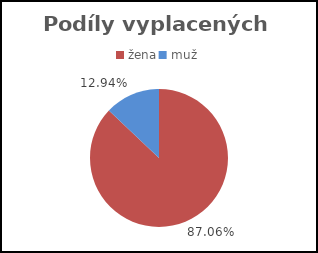
| Category | Celkem |
|---|---|
| žena | 0.871 |
| muž | 0.129 |